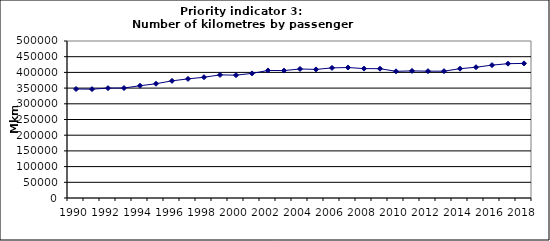
| Category | Number of kilometres by passenger cars, Mkm |
|---|---|
| 1990 | 347121.52 |
| 1991 | 346663.773 |
| 1992 | 349874.831 |
| 1993 | 350271.132 |
| 1994 | 357496.814 |
| 1995 | 363891.087 |
| 1996 | 373090.262 |
| 1997 | 379361.786 |
| 1998 | 384558.439 |
| 1999 | 392061.376 |
| 2000 | 391196.253 |
| 2001 | 396782.462 |
| 2002 | 406184.649 |
| 2003 | 405846.693 |
| 2004 | 410881.608 |
| 2005 | 409491.17 |
| 2006 | 414364.047 |
| 2007 | 415549.977 |
| 2008 | 412136.52 |
| 2009 | 411731.416 |
| 2010 | 403515.283 |
| 2011 | 404765.242 |
| 2012 | 403948.135 |
| 2013 | 403922.674 |
| 2014 | 411862.307 |
| 2015 | 416440.89 |
| 2016 | 423135.26 |
| 2017 | 427758.508 |
| 2018 | 428657.559 |